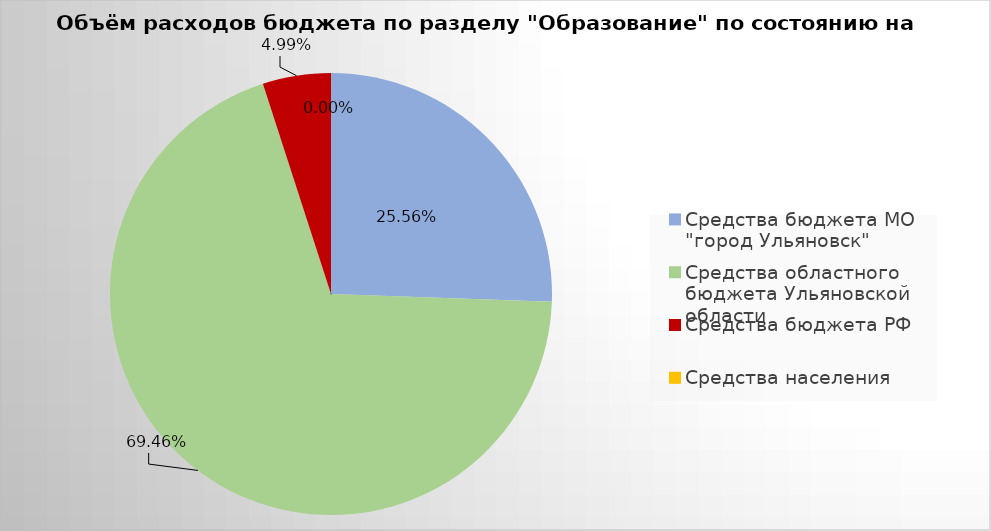
| Category | Series 0 |
|---|---|
| Средства бюджета МО "город Ульяновск" | 2559752.1 |
| Средства областного бюджета Ульяновской области | 6956181.99 |
| Средства бюджета РФ | 499436.26 |
| Средства населения | 0 |